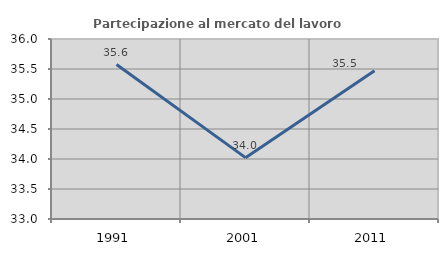
| Category | Partecipazione al mercato del lavoro  femminile |
|---|---|
| 1991.0 | 35.574 |
| 2001.0 | 34.022 |
| 2011.0 | 35.471 |